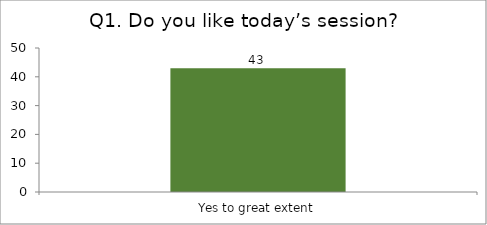
| Category | Q1. Do you like today’s session? |
|---|---|
| Yes to great extent | 43 |